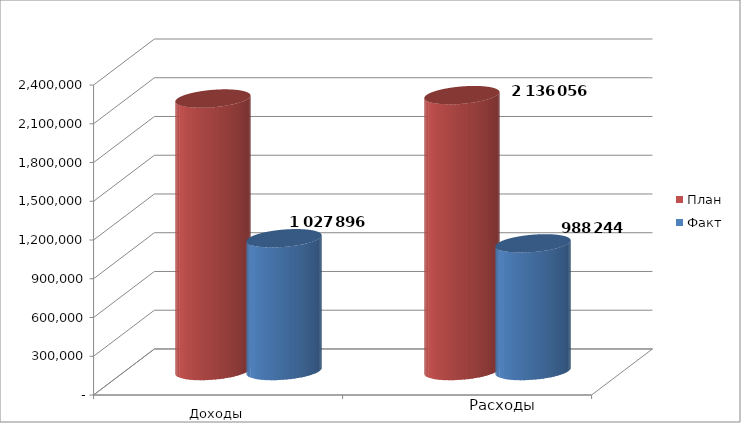
| Category | План | Факт |
|---|---|---|
| 0 | 2109651 | 1027896 |
| 1 | 2136056 | 988243.5 |